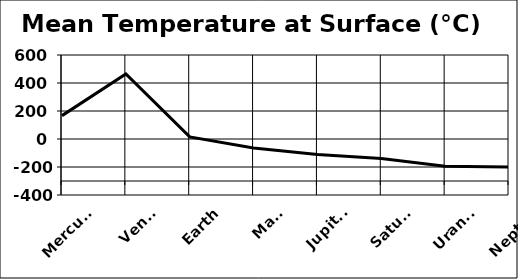
| Category | Mean Temperature at Surface (°C) |
|---|---|
| Mercury | 167 |
| Venus | 464 |
| Earth | 15 |
| Mars | -65 |
| Jupiter | -110 |
| Saturn | -140 |
| Uranus | -195 |
| Neptune | -200 |